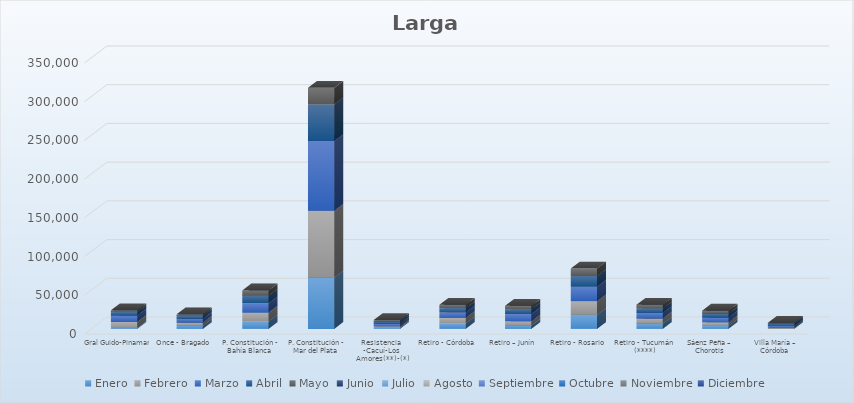
| Category | Enero | Febrero | Marzo | Abril | Mayo | Junio | Julio | Agosto | Septiembre | Octubre | Noviembre | Diciembre |
|---|---|---|---|---|---|---|---|---|---|---|---|---|
| Gral Guido-Pinamar | 1247 | 7686 | 8228 | 4601 | 2286 |  |  |  |  |  |  |  |
| Once - Bragado | 4075 | 4019 | 5137 | 3349 | 2180 |  |  |  |  |  |  |  |
| P. Constitución - Bahía Blanca | 9798 | 11229 | 12329 | 9745 | 6611 |  |  |  |  |  |  |  |
| P. Constitución - Mar del Plata | 66281 | 86376 | 89870 | 47419 | 21416 |  |  |  |  |  |  |  |
| Resistencia -Cacuí-Los Amores(**)-(*) | 1351 | 1797 | 3422 | 2596 | 2171 |  |  |  |  |  |  |  |
| Retiro - Córdoba | 7177 | 6984 | 7052 | 5640 | 4197 |  |  |  |  |  |  |  |
| Retiro – Junín | 4351 | 5398 | 9412 | 6399 | 4218 |  |  |  |  |  |  |  |
| Retiro - Rosario | 18266 | 17392 | 19045 | 13672 | 9707 |  |  |  |  |  |  |  |
| Retiro - Tucumán (****) | 6673 | 6754 | 7246 | 5799 | 4792 |  |  |  |  |  |  |  |
| Sáenz Peña – Chorotis | 3946 | 4508 | 6210 | 4803 | 4084 |  |  |  |  |  |  |  |
| Villa María – Córdoba | 122 | 1583 | 1920 | 3158 | 1144 |  |  |  |  |  |  |  |